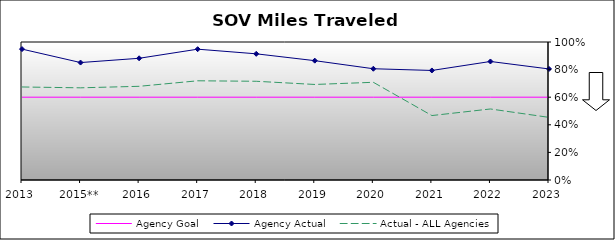
| Category | Agency Goal | Agency Actual | Actual - ALL Agencies |
|---|---|---|---|
| 2013 | 0.6 | 0.948 | 0.674 |
| 2015** | 0.6 | 0.851 | 0.668 |
| 2016 | 0.6 | 0.882 | 0.679 |
| 2017 | 0.6 | 0.948 | 0.719 |
| 2018 | 0.6 | 0.914 | 0.715 |
| 2019 | 0.6 | 0.865 | 0.692 |
| 2020 | 0.6 | 0.806 | 0.708 |
| 2021 | 0.6 | 0.794 | 0.467 |
| 2022 | 0.6 | 0.859 | 0.515 |
| 2023 | 0.6 | 0.805 | 0.454 |